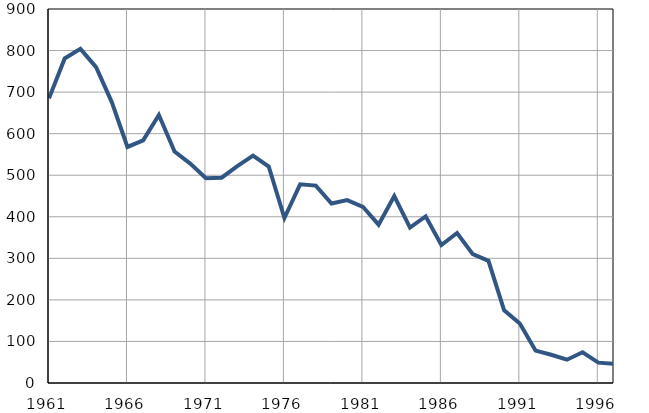
| Category | Умрла 
одојчад |
|---|---|
| 1961.0 | 685 |
| 1962.0 | 781 |
| 1963.0 | 804 |
| 1964.0 | 760 |
| 1965.0 | 676 |
| 1966.0 | 568 |
| 1967.0 | 584 |
| 1968.0 | 645 |
| 1969.0 | 557 |
| 1970.0 | 528 |
| 1971.0 | 493 |
| 1972.0 | 494 |
| 1973.0 | 522 |
| 1974.0 | 547 |
| 1975.0 | 521 |
| 1976.0 | 397 |
| 1977.0 | 478 |
| 1978.0 | 475 |
| 1979.0 | 432 |
| 1980.0 | 440 |
| 1981.0 | 424 |
| 1982.0 | 381 |
| 1983.0 | 450 |
| 1984.0 | 374 |
| 1985.0 | 401 |
| 1986.0 | 332 |
| 1987.0 | 361 |
| 1988.0 | 310 |
| 1989.0 | 294 |
| 1990.0 | 175 |
| 1991.0 | 143 |
| 1992.0 | 78 |
| 1993.0 | 68 |
| 1994.0 | 56 |
| 1995.0 | 74 |
| 1996.0 | 49 |
| 1997.0 | 46 |